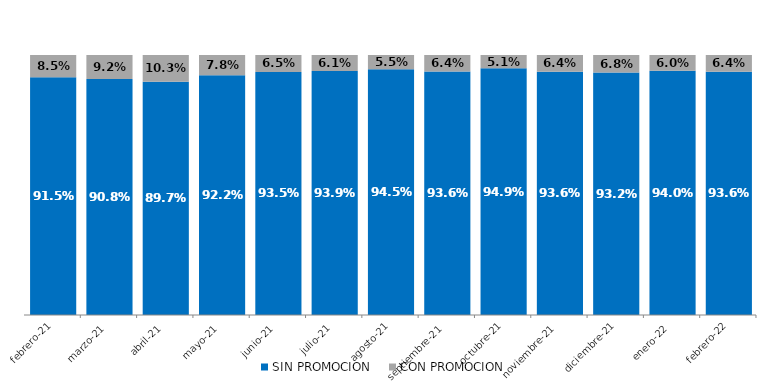
| Category | SIN PROMOCION   | CON PROMOCION   |
|---|---|---|
| 2021-02-01 | 0.915 | 0.085 |
| 2021-03-01 | 0.908 | 0.092 |
| 2021-04-01 | 0.897 | 0.103 |
| 2021-05-01 | 0.922 | 0.078 |
| 2021-06-01 | 0.935 | 0.065 |
| 2021-07-01 | 0.939 | 0.061 |
| 2021-08-01 | 0.945 | 0.055 |
| 2021-09-01 | 0.936 | 0.064 |
| 2021-10-01 | 0.949 | 0.051 |
| 2021-11-01 | 0.936 | 0.064 |
| 2021-12-01 | 0.932 | 0.068 |
| 2022-01-01 | 0.94 | 0.06 |
| 2022-02-01 | 0.936 | 0.064 |